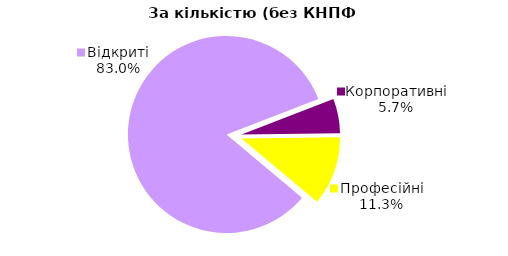
| Category | Series 0 | 30.09.2022 | 31.12.2022** | 30.06.2023 | 30.09.2023 | Зміна за 3-й квартал 2023 року | Зміна за рік | Зміна за 2 роки |
|---|---|---|---|---|---|---|---|---|
| Відкриті | 44 | 47 | 46 | 45 | 46 | 44 | -0.043 | -0.022 |
| Корпоративні | 3 | 4 | 3 | 3 | 3 | 3 | 0 | 0 |
| Професійні | 6 | 6 | 6 | 6 | 6 | 6 | 0 | 0 |